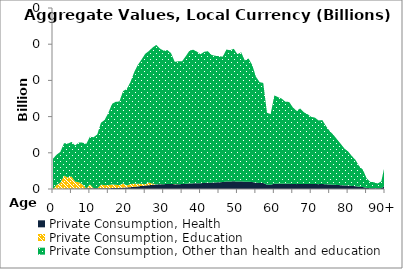
| Category | Private Consumption, Health | Private Consumption, Education | Private Consumption, Other than health and education |
|---|---|---|---|
| 0 | 0 | 0 | 41.886 |
|  | 0.175 | 5.573 | 41.7 |
| 2 | 0.345 | 8.319 | 42.706 |
| 3 | 0.49 | 17.936 | 44.925 |
| 4 | 0.596 | 15.389 | 46.647 |
| 5 | 0.665 | 16.645 | 47.7 |
| 6 | 0.73 | 9.454 | 50.105 |
| 7 | 0.811 | 8.561 | 54.802 |
| 8 | 0.842 | 5.557 | 57.648 |
| 9 | 0.89 | 0 | 61.319 |
| 10 | 0.917 | 5.205 | 66.027 |
| 11 | 0.944 | 0 | 70.555 |
| 12 | 0.937 | 0 | 74.501 |
| 13 | 0.975 | 5.05 | 85.499 |
| 14 | 0.958 | 4.319 | 90.15 |
| 15 | 1.065 | 4.381 | 99.665 |
| 16 | 1.28 | 4.96 | 111.33 |
| 17 | 1.406 | 4.487 | 114.596 |
| 18 | 1.549 | 3.797 | 115.493 |
| 19 | 1.857 | 5.84 | 127.59 |
| 20 | 2.165 | 2.672 | 133.341 |
| 21 | 2.538 | 4.401 | 140.86 |
| 22 | 3.053 | 4.195 | 153.925 |
| 23 | 3.615 | 3.495 | 164.314 |
| 24 | 4.195 | 3.066 | 171.565 |
| 25 | 4.822 | 1.79 | 180.112 |
| 26 | 5.238 | 3.709 | 181.679 |
| 27 | 5.814 | 1.537 | 188.138 |
| 28 | 6.319 | 0.025 | 192.689 |
| 29 | 6.489 | 0.302 | 187.056 |
| 30 | 6.653 | 0.002 | 184.38 |
| 31 | 6.922 | 0 | 184.961 |
| 32 | 6.961 | 0 | 180.727 |
| 33 | 6.614 | 0.197 | 168.79 |
| 34 | 6.694 | 0 | 169.703 |
| 35 | 6.753 | 0 | 169.778 |
| 36 | 7.134 | 0 | 176.306 |
| 37 | 7.571 | 0.025 | 183.592 |
| 38 | 7.796 | 0 | 184.613 |
| 39 | 7.901 | 0 | 181.896 |
| 40 | 7.977 | 0 | 178.125 |
| 41 | 8.391 | 0 | 181.159 |
| 42 | 8.712 | 0 | 181.6 |
| 43 | 8.792 | 0 | 176.406 |
| 44 | 9.049 | 0 | 174.921 |
| 45 | 9.335 | 0 | 174.177 |
| 46 | 9.574 | 0 | 173.171 |
| 47 | 10.313 | 0 | 182.265 |
| 48 | 10.435 | 0 | 181.303 |
| 49 | 10.646 | 0 | 182.971 |
| 50 | 10.349 | 0 | 175.841 |
| 51 | 10.553 | 0 | 178.271 |
| 52 | 9.959 | 0 | 167.6 |
| 53 | 10.112 | 0 | 170.22 |
| 54 | 9.607 | 0 | 161.749 |
| 55 | 8.708 | 0 | 146.432 |
| 56 | 8.308 | 0 | 139.35 |
| 57 | 8.27 | 0 | 138.195 |
| 58 | 5.954 | 0 | 99.348 |
| 59 | 5.882 | 0 | 97.736 |
| 60 | 7.356 | 0 | 121.926 |
| 61 | 7.261 | 0 | 119.628 |
| 62 | 7.24 | 0 | 117.59 |
| 63 | 7.106 | 0 | 113.403 |
| 64 | 7.236 | 0 | 113.168 |
| 65 | 6.923 | 0 | 105.905 |
| 66 | 6.719 | 0 | 101.254 |
| 67 | 7.013 | 0 | 104.105 |
| 68 | 6.822 | 0 | 99.186 |
| 69 | 6.816 | 0 | 96.539 |
| 70 | 6.749 | 0 | 92.901 |
| 71 | 6.826 | 0 | 91.741 |
| 72 | 6.703 | 0 | 87.999 |
| 73 | 6.898 | 0 | 88.324 |
| 74 | 6.475 | 0 | 80.509 |
| 75 | 6.137 | 0 | 73.957 |
| 76 | 5.92 | 0 | 68.972 |
| 77 | 5.6 | 0 | 62.987 |
| 78 | 5.261 | 0 | 57.081 |
| 79 | 4.876 | 0 | 51.021 |
| 80 | 4.67 | 0 | 47.159 |
| 81 | 4.246 | 0 | 41.394 |
| 82 | 3.853 | 0 | 36.3 |
| 83 | 3.114 | 0 | 28.413 |
| 84 | 2.717 | 0 | 23.962 |
| 85 | 1.567 | 0 | 13.371 |
| 86 | 1.069 | 0 | 8.822 |
| 87 | 1.041 | 0 | 8.297 |
| 88 | 0.875 | 0 | 6.731 |
| 89 | 1.253 | 0 | 9.329 |
| 90+ | 4.177 | 0 | 30.083 |